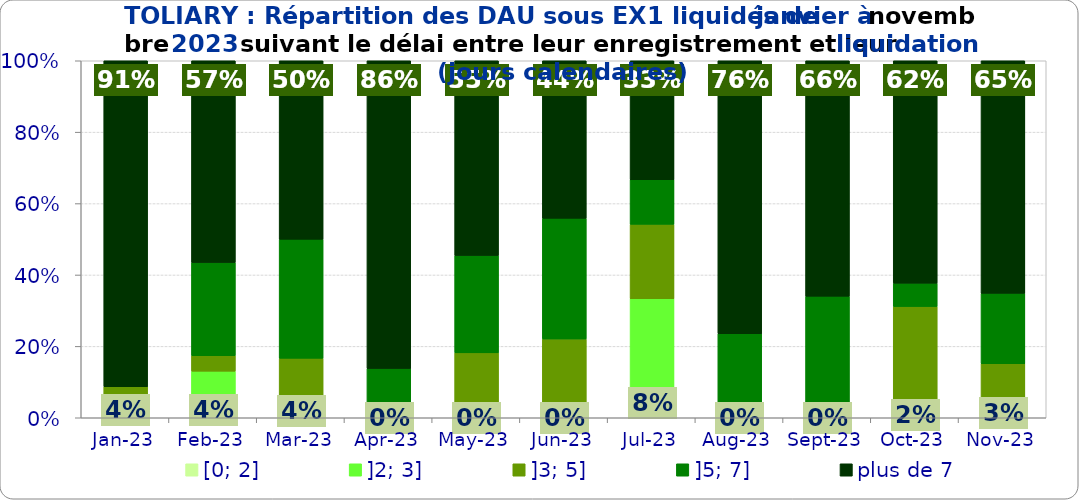
| Category | [0; 2] | ]2; 3] | ]3; 5] | ]5; 7] | plus de 7 |
|---|---|---|---|---|---|
| 2023-01-01 | 0.043 | 0 | 0.043 | 0 | 0.913 |
| 2023-02-01 | 0.043 | 0.087 | 0.043 | 0.261 | 0.565 |
| 2023-03-01 | 0.042 | 0 | 0.125 | 0.333 | 0.5 |
| 2023-04-01 | 0 | 0 | 0.034 | 0.103 | 0.862 |
| 2023-05-01 | 0 | 0 | 0.182 | 0.273 | 0.545 |
| 2023-06-01 | 0 | 0 | 0.221 | 0.338 | 0.441 |
| 2023-07-01 | 0.083 | 0.25 | 0.208 | 0.125 | 0.333 |
| 2023-08-01 | 0 | 0 | 0 | 0.235 | 0.765 |
| 2023-09-01 | 0 | 0 | 0.043 | 0.298 | 0.66 |
| 2023-10-01 | 0.016 | 0 | 0.295 | 0.066 | 0.623 |
| 2023-11-01 | 0.03 | 0.015 | 0.106 | 0.197 | 0.652 |